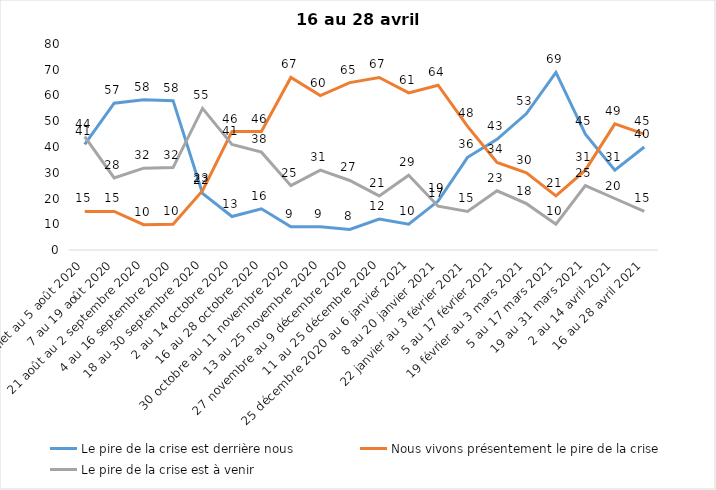
| Category | Le pire de la crise est derrière nous | Nous vivons présentement le pire de la crise | Le pire de la crise est à venir |
|---|---|---|---|
| 24 juillet au 5 août 2020 | 41 | 15 | 44 |
| 7 au 19 août 2020 | 57 | 15 | 28 |
| 21 août au 2 septembre 2020 | 58.39 | 9.84 | 31.77 |
| 4 au 16 septembre 2020 | 58 | 10 | 32 |
| 18 au 30 septembre 2020 | 22 | 23 | 55 |
| 2 au 14 octobre 2020 | 13 | 46 | 41 |
| 16 au 28 octobre 2020 | 16 | 46 | 38 |
| 30 octobre au 11 novembre 2020 | 9 | 67 | 25 |
| 13 au 25 novembre 2020 | 9 | 60 | 31 |
| 27 novembre au 9 décembre 2020 | 8 | 65 | 27 |
| 11 au 25 décembre 2020 | 12 | 67 | 21 |
| 25 décembre 2020 au 6 janvier 2021 | 10 | 61 | 29 |
| 8 au 20 janvier 2021 | 19 | 64 | 17 |
| 22 janvier au 3 février 2021 | 36 | 48 | 15 |
| 5 au 17 février 2021 | 43 | 34 | 23 |
| 19 février au 3 mars 2021 | 53 | 30 | 18 |
| 5 au 17 mars 2021 | 69 | 21 | 10 |
| 19 au 31 mars 2021 | 45 | 31 | 25 |
| 2 au 14 avril 2021 | 31 | 49 | 20 |
| 16 au 28 avril 2021 | 40 | 45 | 15 |